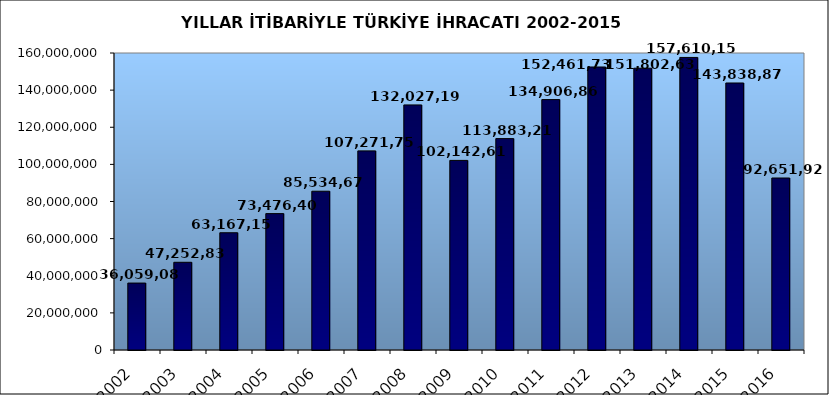
| Category | 2002 |
|---|---|
| 2002.0 | 36059089.029 |
| 2003.0 | 47252836.302 |
| 2004.0 | 63167152.82 |
| 2005.0 | 73476408.143 |
| 2006.0 | 85534675.518 |
| 2007.0 | 107271749.904 |
| 2008.0 | 132027195.626 |
| 2009.0 | 102142612.603 |
| 2010.0 | 113883219.184 |
| 2011.0 | 134906868.83 |
| 2012.0 | 152461736.556 |
| 2013.0 | 151802637.087 |
| 2014.0 | 157610157.69 |
| 2015.0 | 143838871.428 |
| 2016.0 | 92651925.276 |